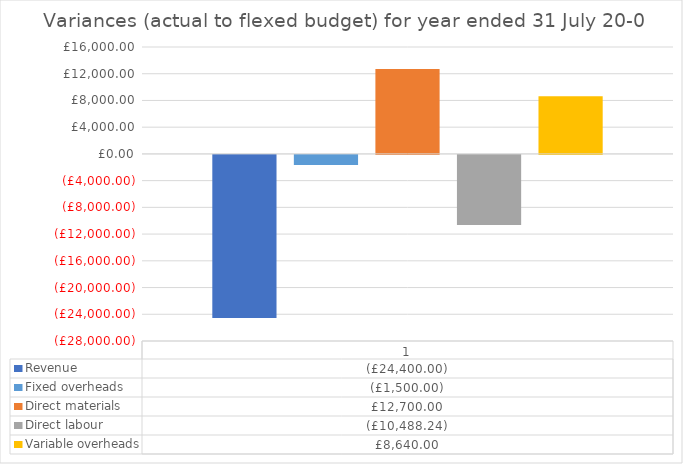
| Category | Revenue | Fixed overheads | Direct materials | Direct labour | Variable overheads |
|---|---|---|---|---|---|
| 0 | -24400 | -1500 | 12700 | -10488.235 | 8640 |